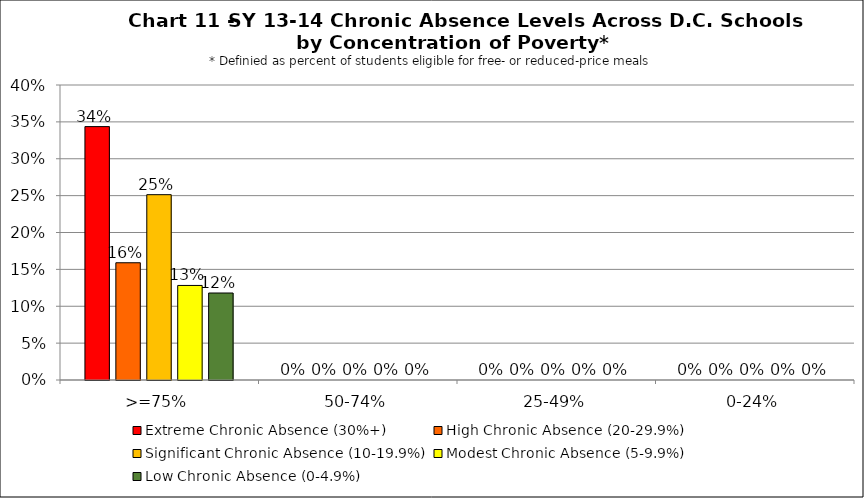
| Category | Extreme Chronic Absence (30%+) | High Chronic Absence (20-29.9%) | Significant Chronic Absence (10-19.9%) | Modest Chronic Absence (5-9.9%) | Low Chronic Absence (0-4.9%) |
|---|---|---|---|---|---|
| 0 | 0.344 | 0.159 | 0.251 | 0.128 | 0.118 |
| 1 | 0 | 0 | 0 | 0 | 0 |
| 2 | 0 | 0 | 0 | 0 | 0 |
| 3 | 0 | 0 | 0 | 0 | 0 |